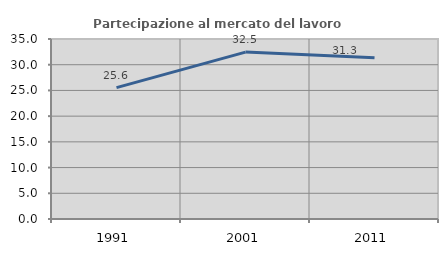
| Category | Partecipazione al mercato del lavoro  femminile |
|---|---|
| 1991.0 | 25.551 |
| 2001.0 | 32.458 |
| 2011.0 | 31.333 |